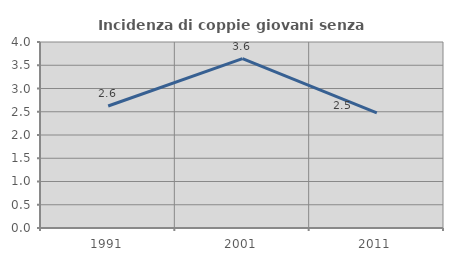
| Category | Incidenza di coppie giovani senza figli |
|---|---|
| 1991.0 | 2.623 |
| 2001.0 | 3.644 |
| 2011.0 | 2.476 |